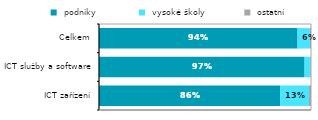
| Category |  podniky  |  vysoké školy |  ostatní  |
|---|---|---|---|
|   ICT zařízení | 0.856 | 0.135 | 0.009 |
|  ICT služby a software | 0.97 | 0.027 | 0.003 |
| Celkem | 0.937 | 0.059 | 0.005 |